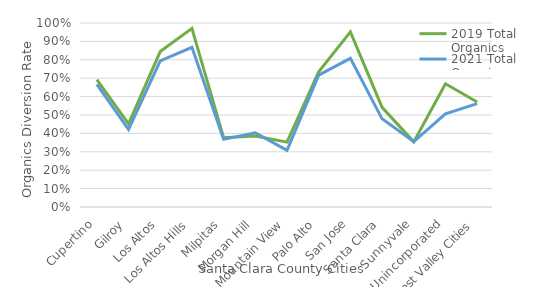
| Category | 2019 Total Organics | 2021 Total Organics |
|---|---|---|
| Cupertino | 0.693 | 0.666 |
| Gilroy | 0.452 | 0.422 |
| Los Altos | 0.845 | 0.794 |
| Los Altos Hills | 0.971 | 0.868 |
| Milpitas | 0.377 | 0.368 |
| Morgan Hill | 0.386 | 0.403 |
| Mountain View | 0.353 | 0.308 |
| Palo Alto | 0.734 | 0.717 |
| San Jose | 0.952 | 0.808 |
| Santa Clara | 0.541 | 0.479 |
| Sunnyvale | 0.354 | 0.355 |
| Unincorporated | 0.67 | 0.506 |
| West Valley Cities | 0.57 | 0.562 |